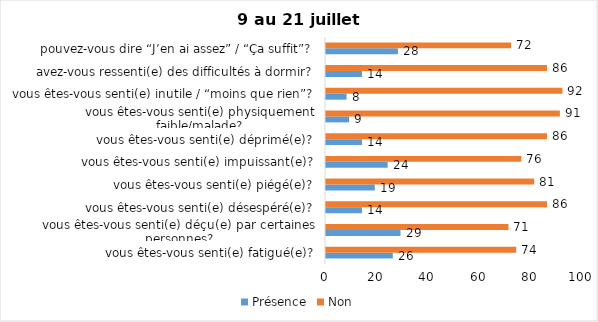
| Category | Présence | Non |
|---|---|---|
| vous êtes-vous senti(e) fatigué(e)? | 26 | 74 |
| vous êtes-vous senti(e) déçu(e) par certaines personnes? | 29 | 71 |
| vous êtes-vous senti(e) désespéré(e)? | 14 | 86 |
| vous êtes-vous senti(e) piégé(e)? | 19 | 81 |
| vous êtes-vous senti(e) impuissant(e)? | 24 | 76 |
| vous êtes-vous senti(e) déprimé(e)? | 14 | 86 |
| vous êtes-vous senti(e) physiquement faible/malade? | 9 | 91 |
| vous êtes-vous senti(e) inutile / “moins que rien”? | 8 | 92 |
| avez-vous ressenti(e) des difficultés à dormir? | 14 | 86 |
| pouvez-vous dire “J’en ai assez” / “Ça suffit”? | 28 | 72 |